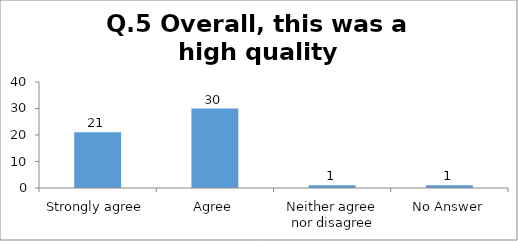
| Category | Q.5 Overall, this was a high quality event/activity |
|---|---|
| Strongly agree | 21 |
| Agree | 30 |
| Neither agree nor disagree | 1 |
| No Answer | 1 |